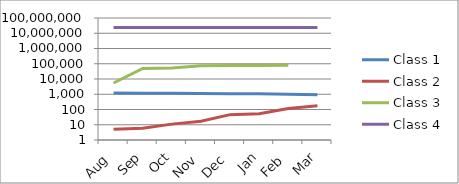
| Category | Class 1 | Class 2 | Class 3 | Class 4 |
|---|---|---|---|---|
| Aug | 1187 | 5 | 5487 | 23954318 |
| Sep | 1184 | 6 | 49493 | 23932519 |
| Oct | 1160 | 11 | 51752 | 23944918 |
| Nov | 1131 | 17 | 74030 | 23941127 |
| Dec | 1078 | 46 | 75711 | 23957573 |
| Jan | 1067 | 53 | 76685 | 23972323 |
| Feb | 990 | 115 | 78345 | 23986004 |
| Mar | 930 | 179 | 0 | 23996449 |